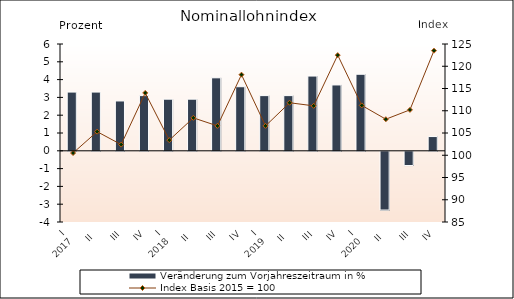
| Category | Veränderung zum Vorjahreszeitraum in % |
|---|---|
| 0 | 3.3 |
| 1 | 3.3 |
| 2 | 2.8 |
| 3 | 3.1 |
| 4 | 2.9 |
| 5 | 2.9 |
| 6 | 4.1 |
| 7 | 3.6 |
| 8 | 3.1 |
| 9 | 3.1 |
| 10 | 4.2 |
| 11 | 3.7 |
| 12 | 4.3 |
| 13 | -3.3 |
| 14 | -0.8 |
| 15 | 0.8 |